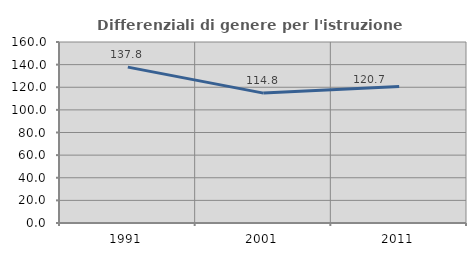
| Category | Differenziali di genere per l'istruzione superiore |
|---|---|
| 1991.0 | 137.79 |
| 2001.0 | 114.821 |
| 2011.0 | 120.668 |